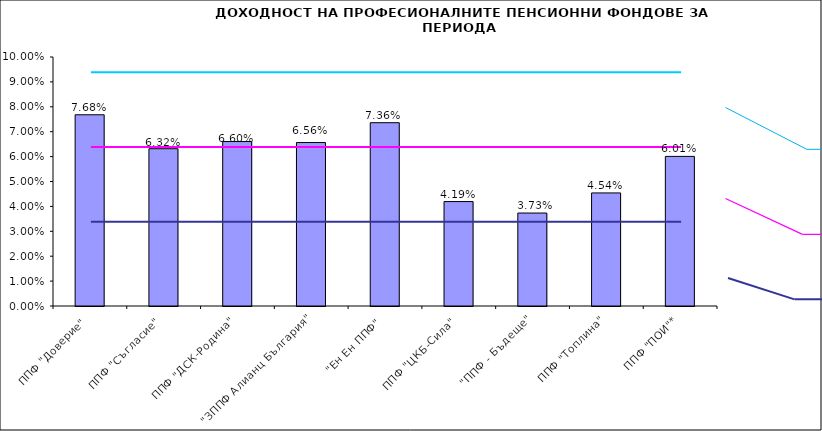
| Category | Series 0 |
|---|---|
| ППФ "Доверие"  | 0.077 |
| ППФ "Съгласие"  | 0.063 |
| ППФ "ДСК-Родина"  | 0.066 |
| "ЗППФ Алианц България"  | 0.066 |
| "Ен Ен ППФ"  | 0.074 |
| ППФ "ЦКБ-Сила"  | 0.042 |
| "ППФ - Бъдеще" | 0.037 |
| ППФ "Топлина" | 0.045 |
| ППФ "ПОИ"* | 0.06 |